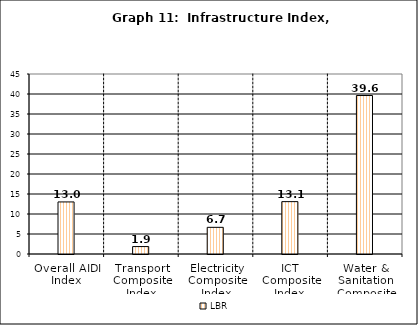
| Category | Series 0 | LBR | Series 2 |
|---|---|---|---|
| Overall AIDI Index |  | 13.019 |  |
| Transport Composite Index |  | 1.859 |  |
| Electricity Composite Index |  | 6.667 |  |
| ICT Composite Index  |  | 13.092 |  |
| Water & Sanitation Composite Index |  | 39.617 |  |